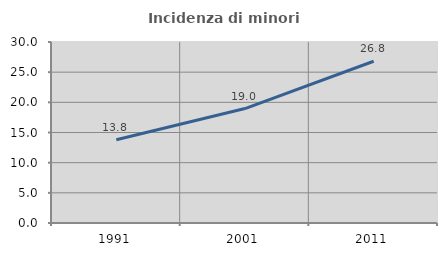
| Category | Incidenza di minori stranieri |
|---|---|
| 1991.0 | 13.793 |
| 2001.0 | 18.966 |
| 2011.0 | 26.809 |